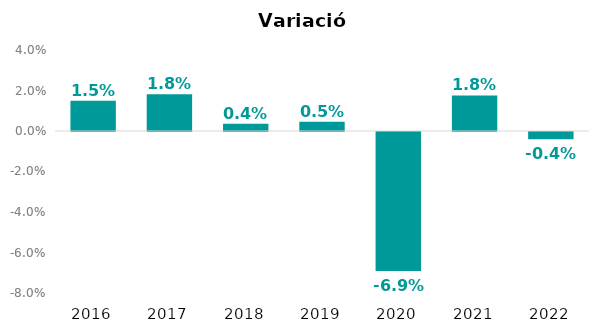
| Category | Variació interanual |
|---|---|
| 2016.0 | 0.015 |
| 2017.0 | 0.018 |
| 2018.0 | 0.004 |
| 2019.0 | 0.005 |
| 2020.0 | -0.069 |
| 2021.0 | 0.018 |
| 2022.0 | -0.004 |